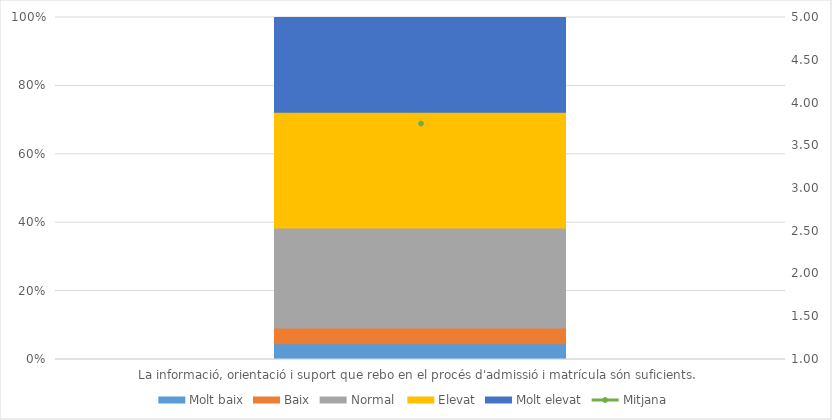
| Category | Molt baix | Baix | Normal  | Elevat | Molt elevat |
|---|---|---|---|---|---|
| La informació, orientació i suport que rebo en el procés d'admissió i matrícula són suficients. | 3 | 3 | 19 | 22 | 18 |